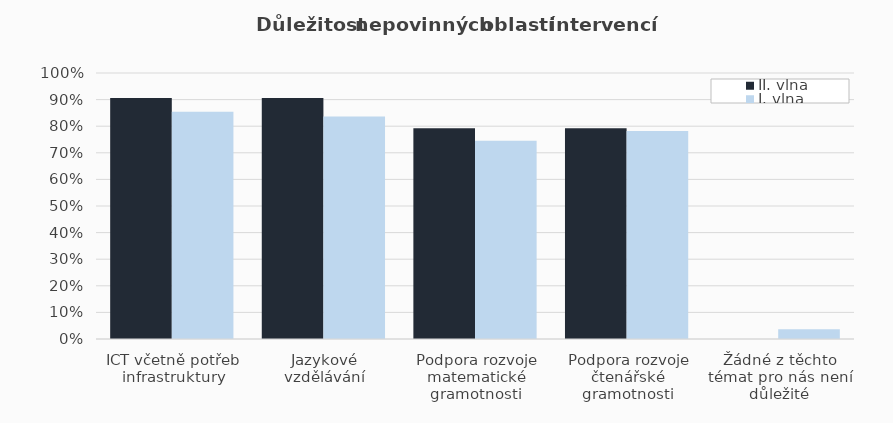
| Category | II. vlna | I. vlna |
|---|---|---|
| ICT včetně potřeb infrastruktury | 0.906 | 0.855 |
| Jazykové vzdělávání | 0.906 | 0.836 |
| Podpora rozvoje matematické gramotnosti | 0.792 | 0.745 |
| Podpora rozvoje čtenářské gramotnosti | 0.792 | 0.782 |
| Žádné z těchto témat pro nás není důležité | 0 | 0.036 |